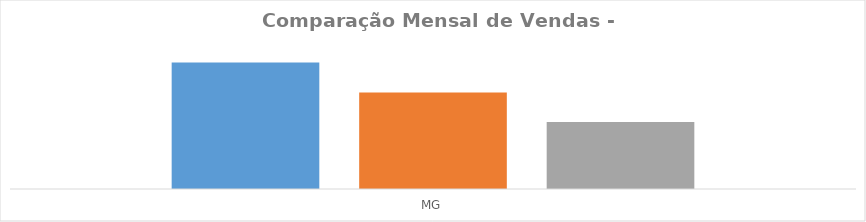
| Category | Soma de FEV | Soma de JAN | Soma de MAR |
|---|---|---|---|
| MG | 1018 | 777 | 539 |